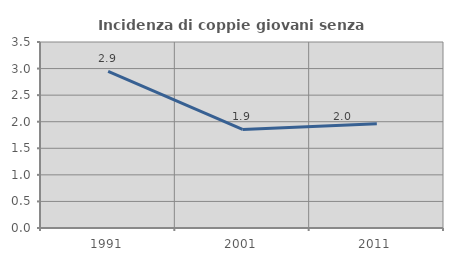
| Category | Incidenza di coppie giovani senza figli |
|---|---|
| 1991.0 | 2.948 |
| 2001.0 | 1.854 |
| 2011.0 | 1.963 |